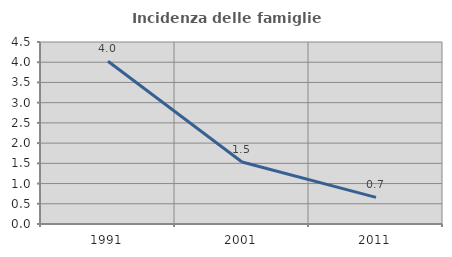
| Category | Incidenza delle famiglie numerose |
|---|---|
| 1991.0 | 4.023 |
| 2001.0 | 1.532 |
| 2011.0 | 0.658 |